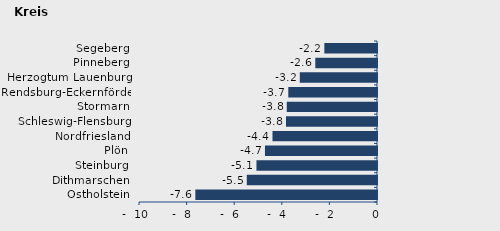
| Category | Überschuss der Geborenen (+) bzw. Gestorbenen (-) |
|---|---|
| Ostholstein | -7.633 |
| Dithmarschen | -5.471 |
| Steinburg | -5.065 |
| Plön | -4.708 |
| Nordfriesland | -4.391 |
| Schleswig-Flensburg | -3.824 |
| Stormarn | -3.792 |
| Rendsburg-Eckernförde | -3.727 |
| Herzogtum Lauenburg | -3.244 |
| Pinneberg | -2.592 |
| Segeberg | -2.212 |